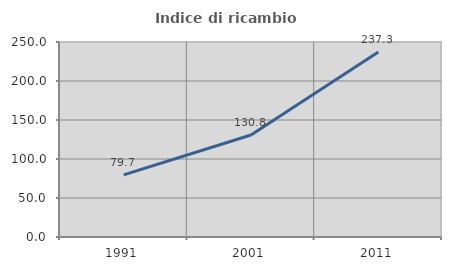
| Category | Indice di ricambio occupazionale  |
|---|---|
| 1991.0 | 79.677 |
| 2001.0 | 130.789 |
| 2011.0 | 237.255 |